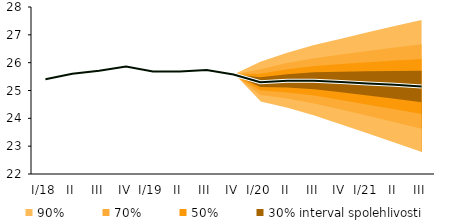
| Category | linka | Centerline |
|---|---|---|
| I/18 | 25.402 | 25.402 |
| II | 25.599 | 25.599 |
| III | 25.711 | 25.711 |
| IV | 25.861 | 25.861 |
| I/19 | 25.684 | 25.684 |
| II | 25.684 | 25.684 |
| III | 25.74 | 25.74 |
| IV | 25.576 | 25.576 |
| I/20 | 25.3 | 25.3 |
| II | 25.347 | 25.347 |
| III | 25.348 | 25.348 |
| IV | 25.304 | 25.304 |
| I/21 | 25.254 | 25.254 |
| II | 25.202 | 25.202 |
| III | 25.144 | 25.144 |